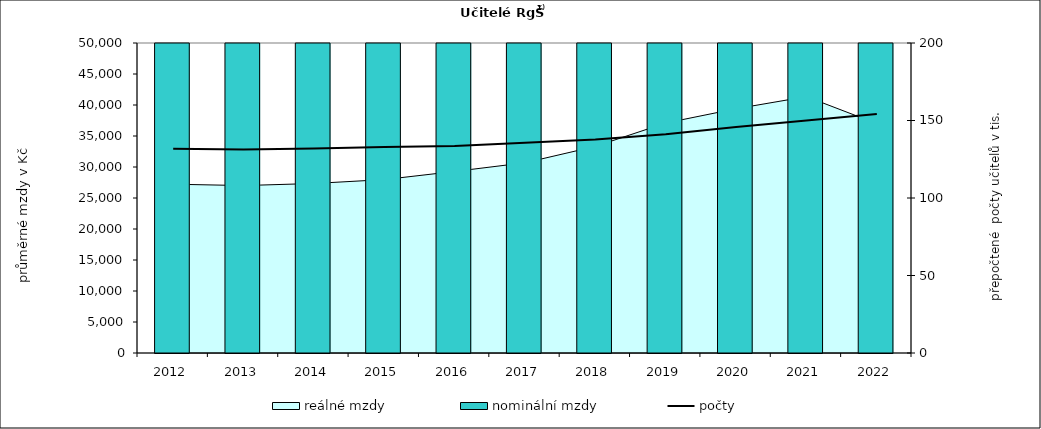
| Category | nominální mzdy |
|---|---|
| 2012.0 | 26654.329 |
| 2013.0 | 26815.833 |
| 2014.0 | 27261.213 |
| 2015.0 | 27969.265 |
| 2016.0 | 29487.404 |
| 2017.0 | 31631.64 |
| 2018.0 | 35088.9 |
| 2019.0 | 40172.121 |
| 2020.0 | 44060.072 |
| 2021.0 | 47589.507 |
| 2022.0 | 48166.88 |